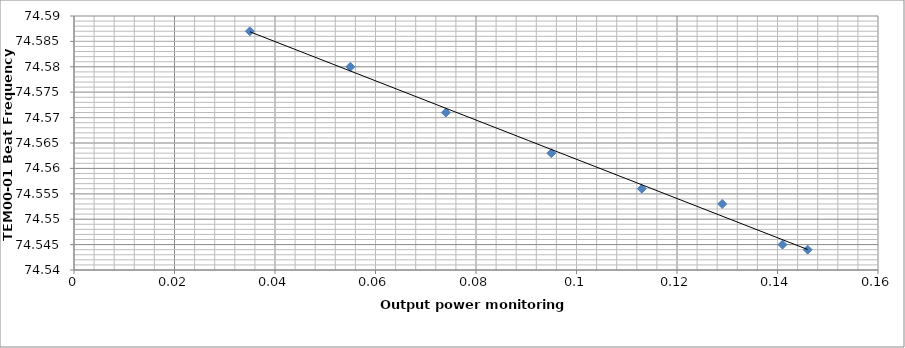
| Category | Series 0 |
|---|---|
| 0.146 | 74.544 |
| 0.141 | 74.545 |
| 0.129 | 74.553 |
| 0.113 | 74.556 |
| 0.095 | 74.563 |
| 0.074 | 74.571 |
| 0.055 | 74.58 |
| 0.035 | 74.587 |